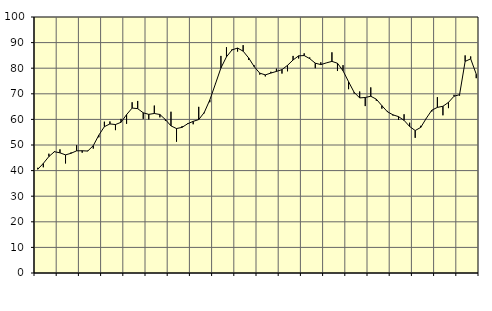
| Category | Piggar | Series 1 |
|---|---|---|
| nan | 41.1 | 40.52 |
| 1.0 | 41.3 | 42.81 |
| 1.0 | 46.6 | 45.5 |
| 1.0 | 47.6 | 47.38 |
| nan | 48.3 | 46.94 |
| 2.0 | 42.8 | 46.14 |
| 2.0 | 47.1 | 46.77 |
| 2.0 | 49.9 | 47.72 |
| nan | 47 | 47.76 |
| 3.0 | 47.8 | 47.63 |
| 3.0 | 48.6 | 49.75 |
| 3.0 | 53 | 53.84 |
| nan | 59.1 | 57.16 |
| 4.0 | 59.2 | 58.23 |
| 4.0 | 55.8 | 57.99 |
| 4.0 | 60.2 | 58.87 |
| nan | 58.3 | 61.86 |
| 5.0 | 66.7 | 64.43 |
| 5.0 | 67.2 | 64.2 |
| 5.0 | 60.2 | 62.58 |
| nan | 60 | 61.97 |
| 6.0 | 65.4 | 62.31 |
| 6.0 | 60.8 | 61.92 |
| 6.0 | 59.4 | 59.91 |
| nan | 63 | 57.47 |
| 7.0 | 51.3 | 56.42 |
| 7.0 | 57.4 | 56.9 |
| 7.0 | 58.5 | 58.29 |
| nan | 58.1 | 59.23 |
| 8.0 | 64.9 | 59.93 |
| 8.0 | 62.4 | 62.71 |
| 8.0 | 66.7 | 67.6 |
| nan | 73.9 | 73.81 |
| 9.0 | 84.8 | 80.1 |
| 9.0 | 88.2 | 84.44 |
| 9.0 | 87.4 | 87.14 |
| nan | 86.5 | 87.87 |
| 10.0 | 89 | 86.66 |
| 10.0 | 83.2 | 84 |
| 10.0 | 81.1 | 80.6 |
| nan | 77.5 | 78.07 |
| 11.0 | 76.8 | 77.39 |
| 11.0 | 78.6 | 78.1 |
| 11.0 | 79.8 | 78.74 |
| nan | 77.9 | 79.44 |
| 12.0 | 78.8 | 81.12 |
| 12.0 | 84.8 | 83.21 |
| 12.0 | 83.8 | 84.83 |
| nan | 85.8 | 84.94 |
| 13.0 | 84.2 | 83.73 |
| 13.0 | 80 | 81.97 |
| 13.0 | 82.3 | 81.4 |
| nan | 82.1 | 82.08 |
| 14.0 | 86.2 | 82.66 |
| 14.0 | 78.9 | 81.93 |
| 14.0 | 81.2 | 78.99 |
| nan | 71.8 | 74.72 |
| 15.0 | 70.1 | 70.58 |
| 15.0 | 70.9 | 68.39 |
| 15.0 | 65.2 | 68.56 |
| nan | 72.5 | 69.04 |
| 16.0 | 67.3 | 67.9 |
| 16.0 | 64.2 | 65.37 |
| 16.0 | 63.3 | 62.98 |
| nan | 61.5 | 61.78 |
| 17.0 | 59.8 | 61.08 |
| 17.0 | 62 | 59.63 |
| 17.0 | 58.7 | 57.24 |
| nan | 52.8 | 55.65 |
| 18.0 | 57.5 | 56.87 |
| 18.0 | 60.3 | 60.41 |
| 18.0 | 63.1 | 63.6 |
| nan | 68.7 | 64.69 |
| 19.0 | 61.6 | 65.13 |
| 19.0 | 64.4 | 66.65 |
| 19.0 | 69.6 | 69.05 |
| nan | 69.3 | 69.66 |
| 20.0 | 85 | 82.65 |
| 20.0 | 84.6 | 83.66 |
| 20.0 | 76.1 | 77.69 |